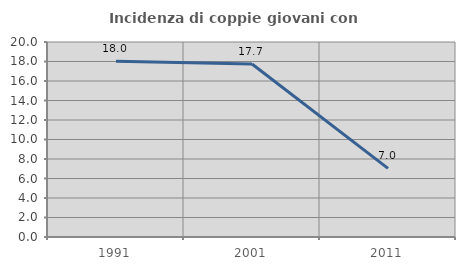
| Category | Incidenza di coppie giovani con figli |
|---|---|
| 1991.0 | 18.033 |
| 2001.0 | 17.742 |
| 2011.0 | 7.042 |